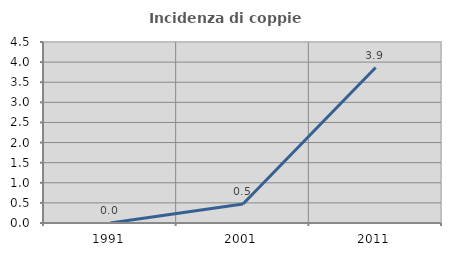
| Category | Incidenza di coppie miste |
|---|---|
| 1991.0 | 0 |
| 2001.0 | 0.472 |
| 2011.0 | 3.865 |